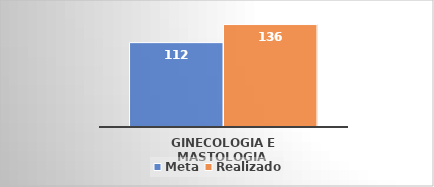
| Category | Meta | Realizado |
|---|---|---|
| Ginecologia e Mastologia  | 112 | 136 |